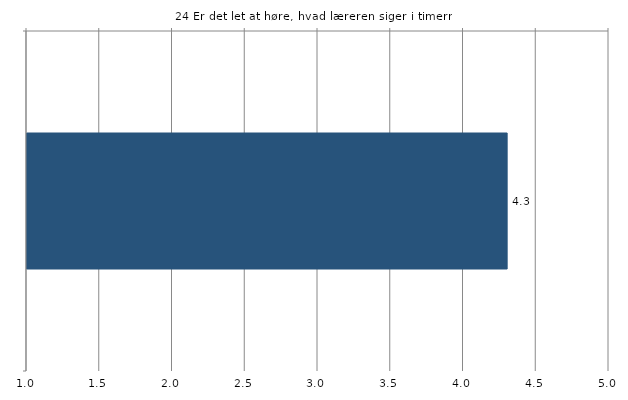
| Category | Gns. |
|---|---|
|   | 4.3 |